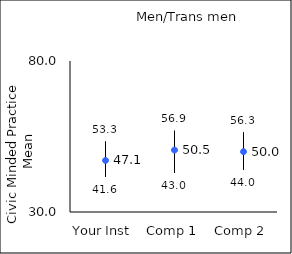
| Category | 25th percentile | 75th percentile | Mean |
|---|---|---|---|
| Your Inst | 41.6 | 53.3 | 47.07 |
| Comp 1 | 43 | 56.9 | 50.51 |
| Comp 2 | 44 | 56.3 | 49.98 |